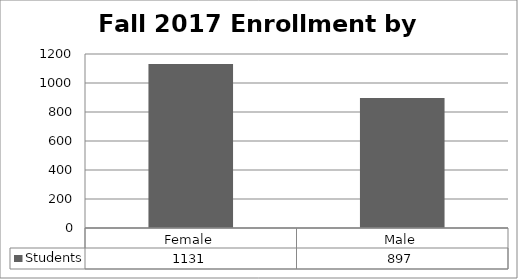
| Category | Students |
|---|---|
| Female | 1131 |
| Male | 897 |